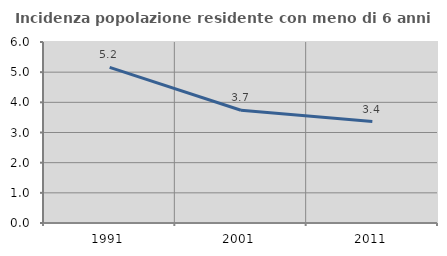
| Category | Incidenza popolazione residente con meno di 6 anni |
|---|---|
| 1991.0 | 5.159 |
| 2001.0 | 3.737 |
| 2011.0 | 3.362 |